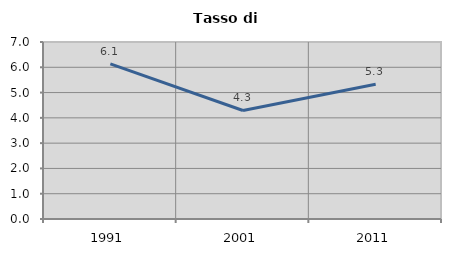
| Category | Tasso di disoccupazione   |
|---|---|
| 1991.0 | 6.132 |
| 2001.0 | 4.292 |
| 2011.0 | 5.326 |